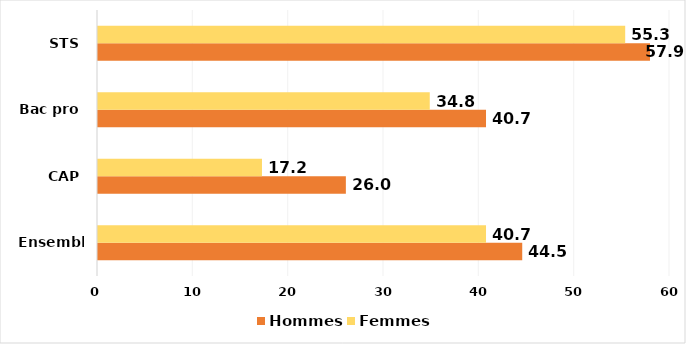
| Category | Hommes | Femmes |
|---|---|---|
| Ensemble | 44.5 | 40.7 |
| CAP | 26 | 17.2 |
| Bac pro | 40.7 | 34.8 |
| STS | 57.9 | 55.3 |